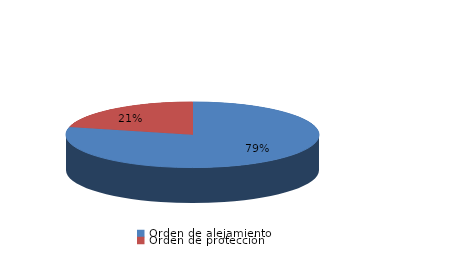
| Category | Series 0 |
|---|---|
| Orden de alejamiento | 26 |
| Orden de protección | 7 |